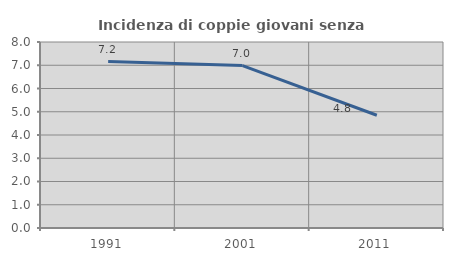
| Category | Incidenza di coppie giovani senza figli |
|---|---|
| 1991.0 | 7.158 |
| 2001.0 | 6.988 |
| 2011.0 | 4.849 |